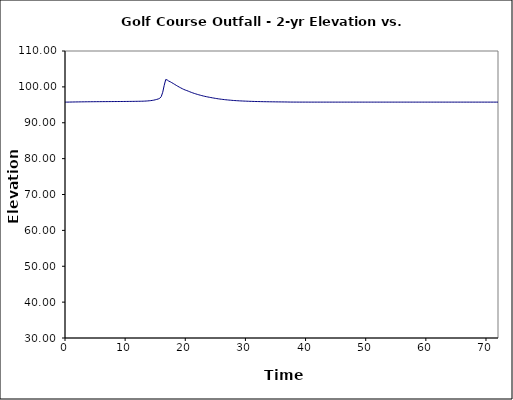
| Category | Series 1 |
|---|---|
| 0.0 | 95.75 |
| 0.25 | 95.751 |
| 0.5 | 95.756 |
| 0.75 | 95.764 |
| 1.0 | 95.774 |
| 1.25 | 95.782 |
| 1.5 | 95.79 |
| 1.75 | 95.797 |
| 2.0 | 95.804 |
| 2.25 | 95.811 |
| 2.5 | 95.818 |
| 2.75 | 95.824 |
| 3.0 | 95.83 |
| 3.25 | 95.835 |
| 3.5 | 95.841 |
| 3.75 | 95.846 |
| 4.0 | 95.851 |
| 4.25 | 95.855 |
| 4.5 | 95.859 |
| 4.75 | 95.863 |
| 5.0 | 95.867 |
| 5.25 | 95.871 |
| 5.5 | 95.876 |
| 5.75 | 95.878 |
| 6.0 | 95.883 |
| 6.25 | 95.885 |
| 6.5 | 95.89 |
| 6.75 | 95.892 |
| 7.0 | 95.895 |
| 7.25 | 95.898 |
| 7.5 | 95.901 |
| 7.75 | 95.904 |
| 8.0 | 95.908 |
| 8.25 | 95.911 |
| 8.5 | 95.913 |
| 8.75 | 95.916 |
| 9.0 | 95.919 |
| 9.25 | 95.922 |
| 9.5 | 95.926 |
| 9.75 | 95.929 |
| 10.0 | 95.933 |
| 10.25 | 95.937 |
| 10.5 | 95.941 |
| 10.75 | 95.945 |
| 11.0 | 95.951 |
| 11.25 | 95.957 |
| 11.5 | 95.962 |
| 11.75 | 95.968 |
| 12.0 | 95.975 |
| 12.25 | 95.982 |
| 12.5 | 95.989 |
| 12.75 | 95.999 |
| 13.0 | 96.013 |
| 13.25 | 96.032 |
| 13.5 | 96.057 |
| 13.75 | 96.087 |
| 14.0 | 96.124 |
| 14.25 | 96.17 |
| 14.5 | 96.225 |
| 14.75 | 96.297 |
| 15.0 | 96.398 |
| 15.25 | 96.511 |
| 15.5 | 96.627 |
| 15.75 | 96.818 |
| 16.0 | 97.285 |
| 16.25 | 98.5 |
| 16.5 | 100.44 |
| 16.75 | 102.054 |
| 17.0 | 101.916 |
| 17.25 | 101.613 |
| 17.5 | 101.428 |
| 17.75 | 101.181 |
| 18.0 | 100.94 |
| 18.25 | 100.676 |
| 18.5 | 100.424 |
| 18.75 | 100.178 |
| 19.0 | 99.941 |
| 19.25 | 99.714 |
| 19.5 | 99.498 |
| 19.75 | 99.293 |
| 20.0 | 99.117 |
| 20.25 | 98.976 |
| 20.5 | 98.804 |
| 20.75 | 98.634 |
| 21.0 | 98.473 |
| 21.25 | 98.321 |
| 21.5 | 98.177 |
| 21.75 | 98.04 |
| 22.0 | 97.912 |
| 22.25 | 97.79 |
| 22.5 | 97.674 |
| 22.75 | 97.564 |
| 23.0 | 97.461 |
| 23.25 | 97.363 |
| 23.5 | 97.272 |
| 23.75 | 97.185 |
| 24.0 | 97.106 |
| 24.25 | 97.028 |
| 24.5 | 96.951 |
| 24.75 | 96.875 |
| 25.0 | 96.801 |
| 25.25 | 96.733 |
| 25.5 | 96.669 |
| 25.75 | 96.609 |
| 26.0 | 96.553 |
| 26.25 | 96.501 |
| 26.5 | 96.452 |
| 26.75 | 96.406 |
| 27.0 | 96.364 |
| 27.25 | 96.324 |
| 27.5 | 96.286 |
| 27.75 | 96.25 |
| 28.0 | 96.215 |
| 28.25 | 96.184 |
| 28.5 | 96.156 |
| 28.75 | 96.131 |
| 29.0 | 96.106 |
| 29.25 | 96.084 |
| 29.5 | 96.063 |
| 29.75 | 96.042 |
| 30.0 | 96.024 |
| 30.25 | 96.007 |
| 30.5 | 95.99 |
| 30.75 | 95.975 |
| 31.0 | 95.961 |
| 31.25 | 95.947 |
| 31.5 | 95.934 |
| 31.75 | 95.923 |
| 32.0 | 95.912 |
| 32.25 | 95.902 |
| 32.5 | 95.892 |
| 32.75 | 95.883 |
| 33.0 | 95.874 |
| 33.25 | 95.866 |
| 33.5 | 95.859 |
| 33.75 | 95.852 |
| 34.0 | 95.845 |
| 34.25 | 95.839 |
| 34.5 | 95.834 |
| 34.75 | 95.828 |
| 35.0 | 95.823 |
| 35.25 | 95.818 |
| 35.5 | 95.813 |
| 35.75 | 95.809 |
| 36.0 | 95.804 |
| 36.25 | 95.8 |
| 36.5 | 95.796 |
| 36.75 | 95.79 |
| 37.0 | 95.784 |
| 37.25 | 95.772 |
| 37.5 | 95.765 |
| 37.75 | 95.763 |
| 38.0 | 95.761 |
| 38.25 | 95.76 |
| 38.5 | 95.758 |
| 38.75 | 95.757 |
| 39.0 | 95.757 |
| 39.25 | 95.756 |
| 39.5 | 95.756 |
| 39.75 | 95.754 |
| 40.0 | 95.754 |
| 40.25 | 95.754 |
| 40.5 | 95.753 |
| 40.75 | 95.753 |
| 41.0 | 95.753 |
| 41.25 | 95.753 |
| 41.5 | 95.751 |
| 41.75 | 95.751 |
| 42.0 | 95.751 |
| 42.25 | 95.751 |
| 42.5 | 95.751 |
| 42.75 | 95.751 |
| 43.0 | 95.751 |
| 43.25 | 95.75 |
| 43.5 | 95.75 |
| 43.75 | 95.75 |
| 44.0 | 95.75 |
| 44.25 | 95.75 |
| 44.5 | 95.75 |
| 44.75 | 95.75 |
| 45.0 | 95.75 |
| 45.25 | 95.75 |
| 45.5 | 95.75 |
| 45.75 | 95.75 |
| 46.0 | 95.75 |
| 46.25 | 95.75 |
| 46.5 | 95.75 |
| 46.75 | 95.75 |
| 47.0 | 95.75 |
| 47.25 | 95.75 |
| 47.5 | 95.75 |
| 47.75 | 95.75 |
| 48.0 | 95.75 |
| 48.25 | 95.75 |
| 48.5 | 95.75 |
| 48.75 | 95.75 |
| 49.0 | 95.75 |
| 49.25 | 95.75 |
| 49.5 | 95.75 |
| 49.75 | 95.75 |
| 50.0 | 95.75 |
| 50.25 | 95.75 |
| 50.5 | 95.75 |
| 50.75 | 95.75 |
| 51.0 | 95.75 |
| 51.25 | 95.75 |
| 51.5 | 95.75 |
| 51.75 | 95.75 |
| 52.0 | 95.75 |
| 52.25 | 95.75 |
| 52.5 | 95.75 |
| 52.75 | 95.75 |
| 53.0 | 95.75 |
| 53.25 | 95.75 |
| 53.5 | 95.75 |
| 53.75 | 95.75 |
| 54.0 | 95.75 |
| 54.25 | 95.75 |
| 54.5 | 95.75 |
| 54.75 | 95.75 |
| 55.0 | 95.75 |
| 55.25 | 95.75 |
| 55.5 | 95.75 |
| 55.75 | 95.75 |
| 56.0 | 95.75 |
| 56.25 | 95.75 |
| 56.5 | 95.75 |
| 56.75 | 95.75 |
| 57.0 | 95.75 |
| 57.25 | 95.75 |
| 57.5 | 95.75 |
| 57.75 | 95.75 |
| 58.0 | 95.75 |
| 58.25 | 95.75 |
| 58.5 | 95.75 |
| 58.75 | 95.75 |
| 59.0 | 95.75 |
| 59.25 | 95.75 |
| 59.5 | 95.75 |
| 59.75 | 95.75 |
| 60.0 | 95.75 |
| 60.25 | 95.75 |
| 60.5 | 95.75 |
| 60.75 | 95.75 |
| 61.0 | 95.75 |
| 61.25 | 95.75 |
| 61.5 | 95.75 |
| 61.75 | 95.75 |
| 62.0 | 95.75 |
| 62.25 | 95.75 |
| 62.5 | 95.75 |
| 62.75 | 95.75 |
| 63.0 | 95.75 |
| 63.25 | 95.75 |
| 63.5 | 95.75 |
| 63.75 | 95.75 |
| 64.0 | 95.75 |
| 64.25 | 95.75 |
| 64.5 | 95.75 |
| 64.75 | 95.75 |
| 65.0 | 95.75 |
| 65.25 | 95.75 |
| 65.5 | 95.75 |
| 65.75 | 95.75 |
| 66.0 | 95.75 |
| 66.25 | 95.75 |
| 66.5 | 95.75 |
| 66.75 | 95.75 |
| 67.0 | 95.75 |
| 67.25 | 95.75 |
| 67.5 | 95.75 |
| 67.75 | 95.75 |
| 68.0 | 95.75 |
| 68.25 | 95.75 |
| 68.5 | 95.75 |
| 68.75 | 95.75 |
| 69.0 | 95.75 |
| 69.25 | 95.75 |
| 69.5 | 95.75 |
| 69.75 | 95.75 |
| 70.0 | 95.75 |
| 70.25 | 95.75 |
| 70.5 | 95.75 |
| 70.75 | 95.75 |
| 71.0 | 95.75 |
| 71.25 | 95.75 |
| 71.5 | 95.75 |
| 71.75 | 95.75 |
| 72.0 | 95.75 |
| 72.25 | 95.75 |
| 72.5 | 95.75 |
| 72.75 | 95.75 |
| 73.0 | 95.75 |
| 73.25 | 95.75 |
| 73.5 | 95.75 |
| 73.75 | 95.75 |
| 74.0 | 95.75 |
| 74.25 | 95.75 |
| 74.5 | 95.75 |
| 74.75 | 95.75 |
| 75.0 | 95.75 |
| 75.25 | 95.75 |
| 75.5 | 95.75 |
| 75.75 | 95.75 |
| 76.0 | 95.75 |
| 76.25 | 95.75 |
| 76.5 | 95.75 |
| 76.75 | 95.75 |
| 77.0 | 95.75 |
| 77.25 | 95.75 |
| 77.5 | 95.75 |
| 77.75 | 95.75 |
| 78.0 | 95.75 |
| 78.25 | 95.75 |
| 78.5 | 95.75 |
| 78.75 | 95.75 |
| 79.0 | 95.75 |
| 79.25 | 95.75 |
| 79.5 | 95.75 |
| 79.75 | 95.75 |
| 80.0 | 95.75 |
| 80.25 | 95.75 |
| 80.5 | 95.75 |
| 80.75 | 95.75 |
| 81.0 | 95.75 |
| 81.25 | 95.75 |
| 81.5 | 95.75 |
| 81.75 | 95.75 |
| 82.0 | 95.75 |
| 82.25 | 95.75 |
| 82.5 | 95.75 |
| 82.75 | 95.75 |
| 83.0 | 95.75 |
| 83.25 | 95.75 |
| 83.5 | 95.75 |
| 83.75 | 95.75 |
| 84.0 | 95.75 |
| 84.25 | 95.75 |
| 84.5 | 95.75 |
| 84.75 | 95.75 |
| 85.0 | 95.75 |
| 85.25 | 95.75 |
| 85.5 | 95.75 |
| 85.75 | 95.75 |
| 86.0 | 95.75 |
| 86.25 | 95.75 |
| 86.5 | 95.75 |
| 86.75 | 95.75 |
| 87.0 | 95.75 |
| 87.25 | 95.75 |
| 87.5 | 95.75 |
| 87.75 | 95.75 |
| 88.0 | 95.75 |
| 88.25 | 95.75 |
| 88.5 | 95.75 |
| 88.75 | 95.75 |
| 89.0 | 95.75 |
| 89.25 | 95.75 |
| 89.5 | 95.75 |
| 89.75 | 95.75 |
| 90.0 | 95.75 |
| 90.25 | 95.75 |
| 90.5 | 95.75 |
| 90.75 | 95.75 |
| 91.0 | 95.75 |
| 91.25 | 95.75 |
| 91.5 | 95.75 |
| 91.75 | 95.75 |
| 92.0 | 95.75 |
| 92.25 | 95.75 |
| 92.5 | 95.75 |
| 92.75 | 95.75 |
| 93.0 | 95.75 |
| 93.25 | 95.75 |
| 93.5 | 95.75 |
| 93.75 | 95.75 |
| 94.0 | 95.75 |
| 94.25 | 95.75 |
| 94.5 | 95.75 |
| 94.75 | 95.75 |
| 95.0 | 95.75 |
| 95.25 | 95.75 |
| 95.5 | 95.75 |
| 95.75 | 95.75 |
| 96.0 | 95.75 |
| 96.25 | 95.75 |
| 96.5 | 95.75 |
| 96.75 | 95.75 |
| 97.0 | 95.75 |
| 97.25 | 95.75 |
| 97.5 | 95.75 |
| 97.75 | 95.75 |
| 98.0 | 95.75 |
| 98.25 | 95.75 |
| 98.5 | 95.75 |
| 98.75 | 95.75 |
| 99.0 | 95.75 |
| 99.25 | 95.75 |
| 99.5 | 95.75 |
| 99.75 | 95.75 |
| 100.0 | 95.75 |
| 100.25 | 95.75 |
| 100.5 | 95.75 |
| 100.75 | 95.75 |
| 101.0 | 95.75 |
| 101.25 | 95.75 |
| 101.5 | 95.75 |
| 101.75 | 95.75 |
| 102.0 | 95.75 |
| 102.25 | 95.75 |
| 102.5 | 95.75 |
| 102.75 | 95.75 |
| 103.0 | 95.75 |
| 103.25 | 95.75 |
| 103.5 | 95.75 |
| 103.75 | 95.75 |
| 104.0 | 95.75 |
| 104.25 | 95.75 |
| 104.5 | 95.75 |
| 104.75 | 95.75 |
| 105.0 | 95.75 |
| 105.25 | 95.75 |
| 105.5 | 95.75 |
| 105.75 | 95.75 |
| 106.0 | 95.75 |
| 106.25 | 95.75 |
| 106.5 | 95.75 |
| 106.75 | 95.75 |
| 107.0 | 95.75 |
| 107.25 | 95.75 |
| 107.5 | 95.75 |
| 107.75 | 95.75 |
| 108.0 | 95.75 |
| 108.25 | 95.75 |
| 108.5 | 95.75 |
| 108.75 | 95.75 |
| 109.0 | 95.75 |
| 109.25 | 95.75 |
| 109.5 | 95.75 |
| 109.75 | 95.75 |
| 110.0 | 95.75 |
| 110.25 | 95.75 |
| 110.5 | 95.75 |
| 110.75 | 95.75 |
| 111.0 | 95.75 |
| 111.25 | 95.75 |
| 111.5 | 95.75 |
| 111.75 | 95.75 |
| 112.0 | 95.75 |
| 112.25 | 95.75 |
| 112.5 | 95.75 |
| 112.75 | 95.75 |
| 113.0 | 95.75 |
| 113.25 | 95.75 |
| 113.5 | 95.75 |
| 113.75 | 95.75 |
| 114.0 | 95.75 |
| 114.25 | 95.75 |
| 114.5 | 95.75 |
| 114.75 | 95.75 |
| 115.0 | 95.75 |
| 115.25 | 95.75 |
| 115.5 | 95.75 |
| 115.75 | 95.75 |
| 116.0 | 95.75 |
| 116.25 | 95.75 |
| 116.5 | 95.75 |
| 116.75 | 95.75 |
| 117.0 | 95.75 |
| 117.25 | 95.75 |
| 117.5 | 95.75 |
| 117.75 | 95.75 |
| 118.0 | 95.75 |
| 118.25 | 95.75 |
| 118.5 | 95.75 |
| 118.75 | 95.75 |
| 119.0 | 95.75 |
| 119.25 | 95.75 |
| 119.5 | 95.75 |
| 119.75 | 95.75 |
| 120.0 | 95.75 |
| 120.25 | 95.75 |
| 120.5 | 95.75 |
| 120.75 | 95.75 |
| 121.0 | 95.75 |
| 121.25 | 95.75 |
| 121.5 | 95.75 |
| 121.75 | 95.75 |
| 122.0 | 95.75 |
| 122.25 | 95.75 |
| 122.5 | 95.75 |
| 122.75 | 95.75 |
| 123.0 | 95.75 |
| 123.25 | 95.75 |
| 123.5 | 95.75 |
| 123.75 | 95.75 |
| 124.0 | 95.75 |
| 124.25 | 95.75 |
| 124.5 | 95.75 |
| 124.75 | 95.75 |
| 125.0 | 95.75 |
| 125.25 | 95.75 |
| 125.5 | 95.75 |
| 125.75 | 95.75 |
| 126.0 | 95.75 |
| 126.25 | 95.75 |
| 126.5 | 95.75 |
| 126.75 | 95.75 |
| 127.0 | 95.75 |
| 127.25 | 95.75 |
| 127.5 | 95.75 |
| 127.75 | 95.75 |
| 128.0 | 95.75 |
| 128.25 | 95.75 |
| 128.5 | 95.75 |
| 128.75 | 95.75 |
| 129.0 | 95.75 |
| 129.25 | 95.75 |
| 129.5 | 95.75 |
| 129.75 | 95.75 |
| 130.0 | 95.75 |
| 130.25 | 95.75 |
| 130.5 | 95.75 |
| 130.75 | 95.75 |
| 131.0 | 95.75 |
| 131.25 | 95.75 |
| 131.5 | 95.75 |
| 131.75 | 95.75 |
| 132.0 | 95.75 |
| 132.25 | 95.75 |
| 132.5 | 95.75 |
| 132.75 | 95.75 |
| 133.0 | 95.75 |
| 133.25 | 95.75 |
| 133.5 | 95.75 |
| 133.75 | 95.75 |
| 134.0 | 95.75 |
| 134.25 | 95.75 |
| 134.5 | 95.75 |
| 134.75 | 95.75 |
| 135.0 | 95.75 |
| 135.25 | 95.75 |
| 135.5 | 95.75 |
| 135.75 | 95.75 |
| 136.0 | 95.75 |
| 136.25 | 95.75 |
| 136.5 | 95.75 |
| 136.75 | 95.75 |
| 137.0 | 95.75 |
| 137.25 | 95.75 |
| 137.5 | 95.75 |
| 137.75 | 95.75 |
| 138.0 | 95.75 |
| 138.25 | 95.75 |
| 138.5 | 95.75 |
| 138.75 | 95.75 |
| 139.0 | 95.75 |
| 139.25 | 95.75 |
| 139.5 | 95.75 |
| 139.75 | 95.75 |
| 140.0 | 95.75 |
| 140.25 | 95.75 |
| 140.5 | 95.75 |
| 140.75 | 95.75 |
| 141.0 | 95.75 |
| 141.25 | 95.75 |
| 141.5 | 95.75 |
| 141.75 | 95.75 |
| 142.0 | 95.75 |
| 142.25 | 95.75 |
| 142.5 | 95.75 |
| 142.75 | 95.75 |
| 143.0 | 95.75 |
| 143.25 | 95.75 |
| 143.5 | 95.75 |
| 143.75 | 95.75 |
| 144.0 | 95.75 |
| 144.25 | 95.75 |
| 144.5 | 95.75 |
| 144.75 | 95.75 |
| 145.0 | 95.75 |
| 145.25 | 95.75 |
| 145.5 | 95.75 |
| 145.75 | 95.75 |
| 146.0 | 95.75 |
| 146.25 | 95.75 |
| 146.5 | 95.75 |
| 146.75 | 95.75 |
| 147.0 | 95.75 |
| 147.25 | 95.75 |
| 147.5 | 95.75 |
| 147.75 | 95.75 |
| 148.0 | 95.75 |
| 148.25 | 95.75 |
| 148.5 | 95.75 |
| 148.75 | 95.75 |
| 149.0 | 95.75 |
| 149.25 | 95.75 |
| 149.5 | 95.75 |
| 149.75 | 95.75 |
| 150.0 | 95.75 |
| 150.25 | 95.75 |
| 150.5 | 95.75 |
| 150.75 | 95.75 |
| 151.0 | 95.75 |
| 151.25 | 95.75 |
| 151.5 | 95.75 |
| 151.75 | 95.75 |
| 152.0 | 95.75 |
| 152.25 | 95.75 |
| 152.5 | 95.75 |
| 152.75 | 95.75 |
| 153.0 | 95.75 |
| 153.25 | 95.75 |
| 153.5 | 95.75 |
| 153.75 | 95.75 |
| 154.0 | 95.75 |
| 154.25 | 95.75 |
| 154.5 | 95.75 |
| 154.75 | 95.75 |
| 155.0 | 95.75 |
| 155.25 | 95.75 |
| 155.5 | 95.75 |
| 155.75 | 95.75 |
| 156.0 | 95.75 |
| 156.25 | 95.75 |
| 156.5 | 95.75 |
| 156.75 | 95.75 |
| 157.0 | 95.75 |
| 157.25 | 95.75 |
| 157.5 | 95.75 |
| 157.75 | 95.75 |
| 158.0 | 95.75 |
| 158.25 | 95.75 |
| 158.5 | 95.75 |
| 158.75 | 95.75 |
| 159.0 | 95.75 |
| 159.25 | 95.75 |
| 159.5 | 95.75 |
| 159.75 | 95.75 |
| 160.0 | 95.75 |
| 160.25 | 95.75 |
| 160.5 | 95.75 |
| 160.75 | 95.75 |
| 161.0 | 95.75 |
| 161.25 | 95.75 |
| 161.5 | 95.75 |
| 161.75 | 95.75 |
| 162.0 | 95.75 |
| 162.25 | 95.75 |
| 162.5 | 95.75 |
| 162.75 | 95.75 |
| 163.0 | 95.75 |
| 163.25 | 95.75 |
| 163.5 | 95.75 |
| 163.75 | 95.75 |
| 164.0 | 95.75 |
| 164.25 | 95.75 |
| 164.5 | 95.75 |
| 164.75 | 95.75 |
| 165.0 | 95.75 |
| 165.25 | 95.75 |
| 165.5 | 95.75 |
| 165.75 | 95.75 |
| 166.0 | 95.75 |
| 166.25 | 95.75 |
| 166.5 | 95.75 |
| 166.75 | 95.75 |
| 167.0 | 95.75 |
| 167.25 | 95.75 |
| 167.5 | 95.75 |
| 167.75 | 95.75 |
| 168.0 | 95.75 |
| 168.25 | 95.75 |
| 168.5 | 95.75 |
| 168.75 | 95.75 |
| 169.0 | 95.75 |
| 169.25 | 95.75 |
| 169.5 | 95.75 |
| 169.75 | 95.75 |
| 170.0 | 95.75 |
| 170.25 | 95.75 |
| 170.5 | 95.75 |
| 170.75 | 95.75 |
| 171.0 | 95.75 |
| 171.25 | 95.75 |
| 171.5 | 95.75 |
| 171.75 | 95.75 |
| 172.0 | 95.75 |
| 172.25 | 95.75 |
| 172.5 | 95.75 |
| 172.75 | 95.75 |
| 173.0 | 95.75 |
| 173.25 | 95.75 |
| 173.5 | 95.75 |
| 173.75 | 95.75 |
| 174.0 | 95.75 |
| 174.25 | 95.75 |
| 174.5 | 95.75 |
| 174.75 | 95.75 |
| 175.0 | 95.75 |
| 175.25 | 95.75 |
| 175.5 | 95.75 |
| 175.75 | 95.75 |
| 176.0 | 95.75 |
| 176.25 | 95.75 |
| 176.5 | 95.75 |
| 176.75 | 95.75 |
| 177.0 | 95.75 |
| 177.25 | 95.75 |
| 177.5 | 95.75 |
| 177.75 | 95.75 |
| 178.0 | 95.75 |
| 178.25 | 95.75 |
| 178.5 | 95.75 |
| 178.75 | 95.75 |
| 179.0 | 95.75 |
| 179.25 | 95.75 |
| 179.5 | 95.75 |
| 179.75 | 95.75 |
| 180.0 | 95.75 |
| 180.25 | 95.75 |
| 180.5 | 95.75 |
| 180.75 | 95.75 |
| 181.0 | 95.75 |
| 181.25 | 95.75 |
| 181.5 | 95.75 |
| 181.75 | 95.75 |
| 182.0 | 95.75 |
| 182.25 | 95.75 |
| 182.5 | 95.75 |
| 182.75 | 95.75 |
| 183.0 | 95.75 |
| 183.25 | 95.75 |
| 183.5 | 95.75 |
| 183.75 | 95.75 |
| 184.0 | 95.75 |
| 184.25 | 95.75 |
| 184.5 | 95.75 |
| 184.75 | 95.75 |
| 185.0 | 95.75 |
| 185.25 | 95.75 |
| 185.5 | 95.75 |
| 185.75 | 95.75 |
| 186.0 | 95.75 |
| 186.25 | 95.75 |
| 186.5 | 95.75 |
| 186.75 | 95.75 |
| 187.0 | 95.75 |
| 187.25 | 95.75 |
| 187.5 | 95.75 |
| 187.75 | 95.75 |
| 188.0 | 95.75 |
| 188.25 | 95.75 |
| 188.5 | 95.75 |
| 188.75 | 95.75 |
| 189.0 | 95.75 |
| 189.25 | 95.75 |
| 189.5 | 95.75 |
| 189.75 | 95.75 |
| 190.0 | 95.75 |
| 190.25 | 95.75 |
| 190.5 | 95.75 |
| 190.75 | 95.75 |
| 191.0 | 95.75 |
| 191.25 | 95.75 |
| 191.5 | 95.75 |
| 191.75 | 95.75 |